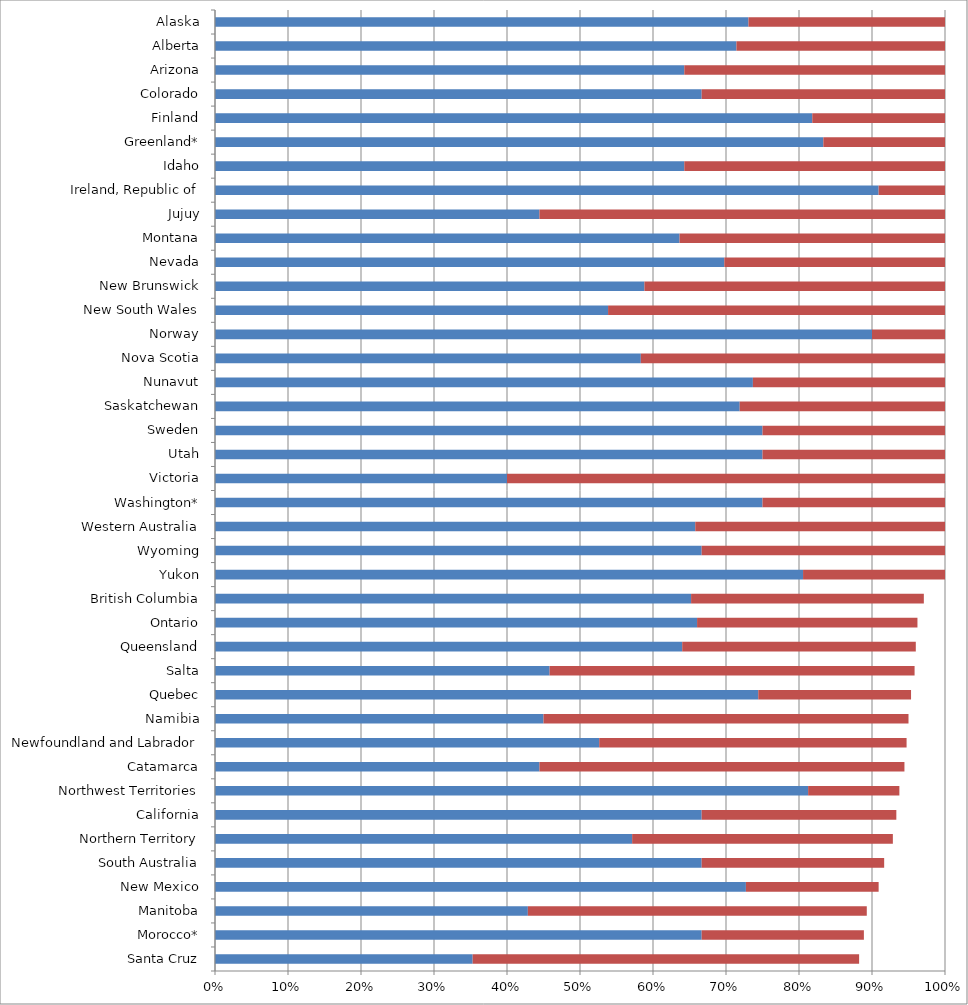
| Category | Series 0 | Series 1 |
|---|---|---|
| Santa Cruz | 0.353 | 0.529 |
| Morocco* | 0.667 | 0.222 |
| Manitoba | 0.429 | 0.464 |
| New Mexico | 0.727 | 0.182 |
| South Australia | 0.667 | 0.25 |
| Northern Territory | 0.571 | 0.357 |
| California | 0.667 | 0.267 |
| Northwest Territories | 0.812 | 0.125 |
| Catamarca | 0.444 | 0.5 |
| Newfoundland and Labrador | 0.526 | 0.421 |
| Namibia | 0.45 | 0.5 |
| Quebec | 0.744 | 0.209 |
| Salta | 0.458 | 0.5 |
| Queensland | 0.64 | 0.32 |
| Ontario | 0.66 | 0.302 |
| British Columbia | 0.652 | 0.319 |
| Yukon | 0.806 | 0.194 |
| Wyoming | 0.667 | 0.333 |
| Western Australia | 0.658 | 0.342 |
| Washington* | 0.75 | 0.25 |
| Victoria | 0.4 | 0.6 |
| Utah | 0.75 | 0.25 |
| Sweden | 0.75 | 0.25 |
| Saskatchewan | 0.719 | 0.281 |
| Nunavut | 0.737 | 0.263 |
| Nova Scotia | 0.583 | 0.417 |
| Norway | 0.9 | 0.1 |
| New South Wales | 0.538 | 0.462 |
| New Brunswick | 0.588 | 0.412 |
| Nevada | 0.698 | 0.302 |
| Montana | 0.636 | 0.364 |
| Jujuy | 0.444 | 0.556 |
| Ireland, Republic of | 0.909 | 0.091 |
| Idaho | 0.643 | 0.357 |
| Greenland* | 0.833 | 0.167 |
| Finland | 0.818 | 0.182 |
| Colorado | 0.667 | 0.333 |
| Arizona | 0.643 | 0.357 |
| Alberta | 0.714 | 0.286 |
| Alaska | 0.731 | 0.269 |